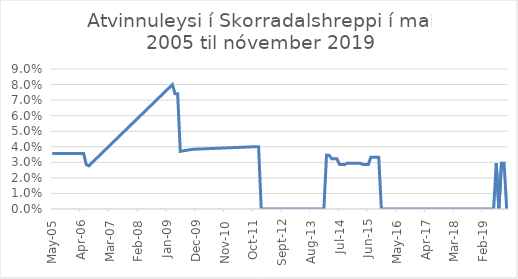
| Category | Series 0 |
|---|---|
| 2005-05-01 | 0.036 |
| 2005-06-01 | 0.036 |
| 2005-07-01 | 0.036 |
| 2005-08-01 | 0.036 |
| 2005-12-01 | 0.036 |
| 2006-01-01 | 0.036 |
| 2006-02-01 | 0.036 |
| 2006-03-01 | 0.036 |
| 2006-04-01 | 0.036 |
| 2006-05-01 | 0.036 |
| 2006-06-01 | 0.029 |
| 2006-07-01 | 0.028 |
| 2009-03-01 | 0.08 |
| 2009-04-01 | 0.074 |
| 2009-05-01 | 0.074 |
| 2009-06-01 | 0.037 |
| 2009-11-01 | 0.038 |
| 2009-12-01 | 0.038 |
| 2011-10-01 | 0.04 |
| 2011-11-01 | 0.04 |
| 2011-12-01 | 0.04 |
| 2012-01-01 | 0 |
| 2012-02-01 | 0 |
| 2012-03-01 | 0 |
| 2012-04-01 | 0 |
| 2012-05-01 | 0 |
| 2012-06-01 | 0 |
| 2012-07-01 | 0 |
| 2012-08-01 | 0 |
| 2012-09-01 | 0 |
| 2012-10-01 | 0 |
| 2012-11-01 | 0 |
| 2012-12-01 | 0 |
| 2013-01-01 | 0 |
| 2013-02-01 | 0 |
| 2013-03-01 | 0 |
| 2013-04-01 | 0 |
| 2013-05-01 | 0 |
| 2013-06-01 | 0 |
| 2013-07-01 | 0 |
| 2013-08-01 | 0 |
| 2013-09-01 | 0 |
| 2013-10-01 | 0 |
| 2013-11-01 | 0 |
| 2013-12-01 | 0 |
| 2014-01-01 | 0 |
| 2014-02-01 | 0.034 |
| 2014-03-01 | 0.034 |
| 2014-04-01 | 0.032 |
| 2014-05-01 | 0.032 |
| 2014-06-01 | 0.032 |
| 2014-07-01 | 0.029 |
| 2014-08-01 | 0.029 |
| 2014-09-01 | 0.029 |
| 2014-10-01 | 0.029 |
| 2014-11-01 | 0.029 |
| 2014-12-01 | 0.029 |
| 2015-01-01 | 0.029 |
| 2015-02-01 | 0.029 |
| 2015-03-01 | 0.029 |
| 2015-04-01 | 0.029 |
| 2015-05-01 | 0.029 |
| 2015-06-01 | 0.029 |
| 2015-07-01 | 0.033 |
| 2015-08-01 | 0.033 |
| 2015-09-01 | 0.033 |
| 2015-10-01 | 0.033 |
| 2015-11-01 | 0 |
| 2015-12-01 | 0 |
| 2016-01-01 | 0 |
| 2016-02-01 | 0 |
| 2016-03-01 | 0 |
| 2016-04-01 | 0 |
| 2016-05-01 | 0 |
| 2016-06-01 | 0 |
| 2016-07-01 | 0 |
| 2016-08-01 | 0 |
| 2016-09-01 | 0 |
| 2016-10-01 | 0 |
| 2016-11-01 | 0 |
| 2016-12-01 | 0 |
| 2017-01-01 | 0 |
| 2017-02-01 | 0 |
| 2017-03-01 | 0 |
| 2017-04-01 | 0 |
| 2017-05-01 | 0 |
| 2017-06-01 | 0 |
| 2017-07-01 | 0 |
| 2017-08-01 | 0 |
| 2017-09-01 | 0 |
| 2017-10-01 | 0 |
| 2017-11-01 | 0 |
| 2017-12-01 | 0 |
| 2018-01-01 | 0 |
| 2018-02-01 | 0 |
| 2018-03-01 | 0 |
| 2018-04-01 | 0 |
| 2018-05-01 | 0 |
| 2018-06-01 | 0 |
| 2018-07-01 | 0 |
| 2018-08-01 | 0 |
| 2018-09-01 | 0 |
| 2018-10-01 | 0 |
| 2018-11-01 | 0 |
| 2018-12-01 | 0 |
| 2019-01-01 | 0 |
| 2019-02-01 | 0 |
| 2019-03-01 | 0 |
| 2019-04-01 | 0 |
| 2019-05-01 | 0 |
| 2019-06-01 | 0 |
| 2019-07-01 | 0.029 |
| 2019-08-01 | 0 |
| 2019-09-01 | 0.029 |
| 2019-10-01 | 0.029 |
| 2019-11-01 | 0 |